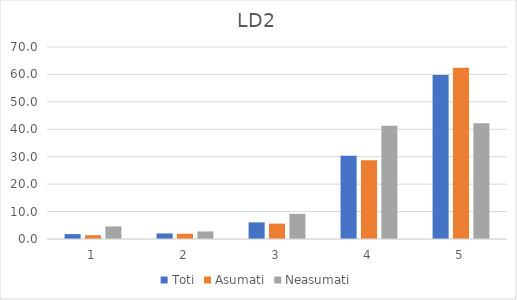
| Category | Toti | Asumati | Neasumati |
|---|---|---|---|
| 0 | 1.784 | 1.366 | 4.587 |
| 1 | 2.021 | 1.913 | 2.752 |
| 2 | 6.064 | 5.601 | 9.174 |
| 3 | 30.321 | 28.689 | 41.284 |
| 4 | 59.81 | 62.432 | 42.202 |